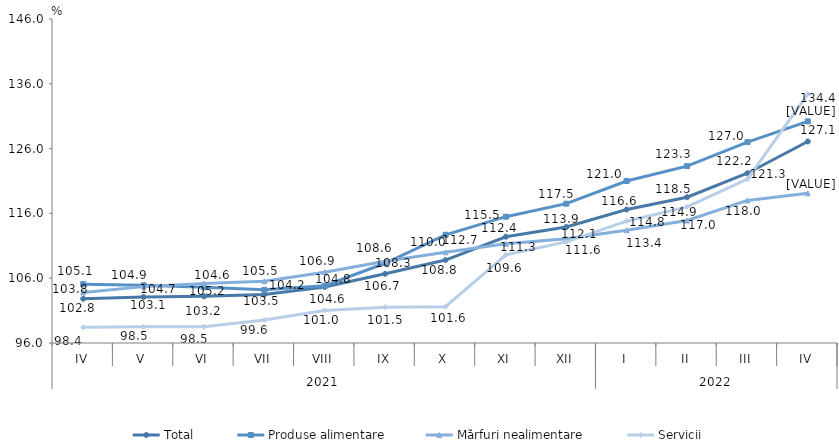
| Category | Total  | Produse alimentare | Mărfuri nealimentare  | Servicii |
|---|---|---|---|---|
| 0 | 102.826 | 105.075 | 103.801 | 98.417 |
| 1 | 103.1 | 104.9 | 104.7 | 98.5 |
| 2 | 103.2 | 104.6 | 105.2 | 98.5 |
| 3 | 103.49 | 104.2 | 105.54 | 99.55 |
| 4 | 104.645 | 104.834 | 106.928 | 101.023 |
| 5 | 106.675 | 108.308 | 108.624 | 101.521 |
| 6 | 108.8 | 112.7 | 110 | 101.6 |
| 7 | 112.4 | 115.494 | 111.3 | 109.6 |
| 8 | 113.9 | 117.5 | 112.1 | 111.6 |
| 9 | 116.6 | 121 | 113.4 | 114.8 |
| 10 | 118.5 | 123.3 | 114.9 | 117 |
| 11 | 122.2 | 127 | 118 | 121.3 |
| 12 | 127.1 | 130.2 | 119.1 | 134.4 |